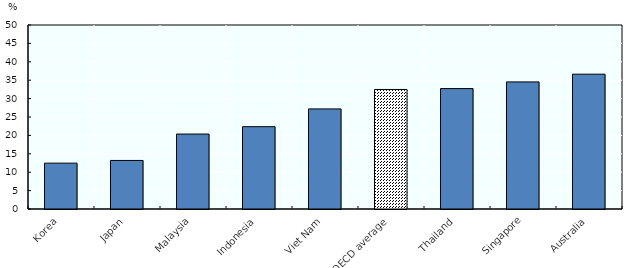
| Category | Series 1 |
|---|---|
| Korea | 12.46 |
| Japan | 13.194 |
| Malaysia | 20.365 |
| Indonesia | 22.375 |
| Viet Nam | 27.199 |
| OECD average | 32.483 |
| Thailand | 32.721 |
| Singapore | 34.535 |
| Australia | 36.637 |